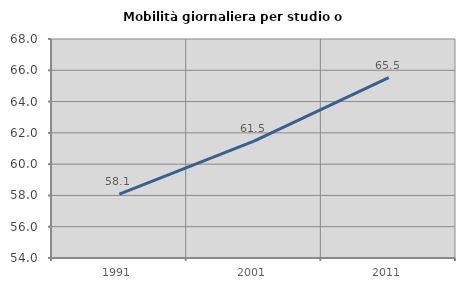
| Category | Mobilità giornaliera per studio o lavoro |
|---|---|
| 1991.0 | 58.081 |
| 2001.0 | 61.468 |
| 2011.0 | 65.535 |